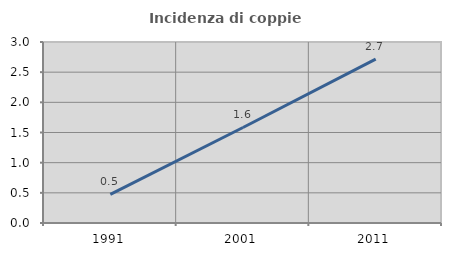
| Category | Incidenza di coppie miste |
|---|---|
| 1991.0 | 0.474 |
| 2001.0 | 1.583 |
| 2011.0 | 2.716 |